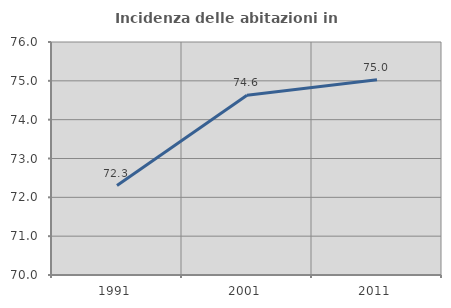
| Category | Incidenza delle abitazioni in proprietà  |
|---|---|
| 1991.0 | 72.303 |
| 2001.0 | 74.626 |
| 2011.0 | 75.029 |